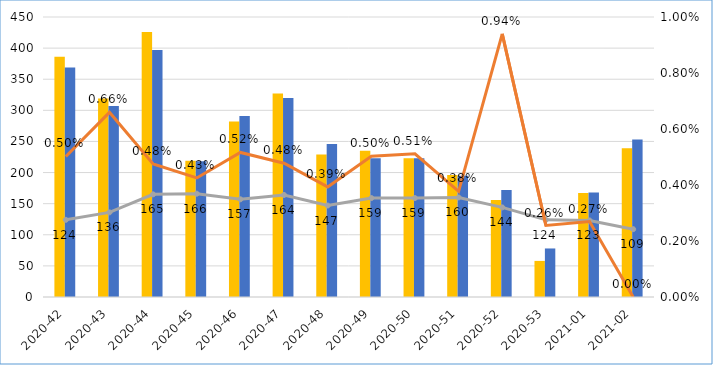
| Category | neue Rekla-Pos | abgeschlossene Rekla-Pos |
|---|---|---|
| 2020-42 | 386 | 369 |
| 2020-43 | 319 | 307 |
| 2020-44 | 426 | 397 |
| 2020-45 | 219 | 218 |
| 2020-46 | 282 | 291 |
| 2020-47 | 327 | 320 |
| 2020-48 | 229 | 246 |
| 2020-49 | 235 | 223 |
| 2020-50 | 223 | 223 |
| 2020-51 | 196 | 195 |
| 2020-52 | 156 | 172 |
| 2020-53 | 58 | 78 |
| 2021-01 | 167 | 168 |
| 2021-02 | 239 | 253 |